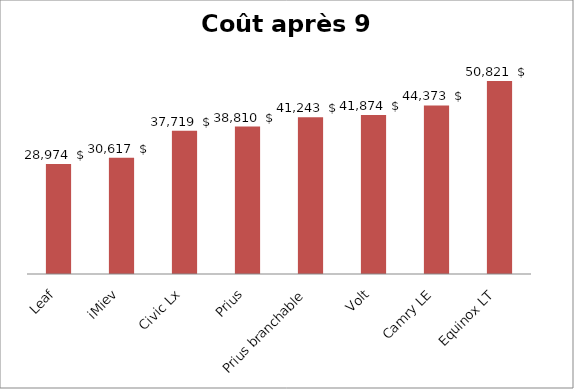
| Category | après 9 ans |
|---|---|
| Leaf | 28973.899 |
| iMiev | 30616.851 |
| Civic Lx | 37718.82 |
| Prius | 38809.824 |
| Prius branchable | 41242.595 |
| Volt | 41874.402 |
| Camry LE | 44372.988 |
| Equinox LT | 50821.402 |